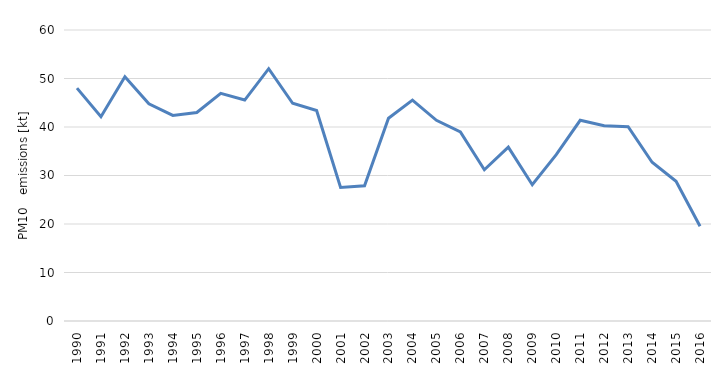
| Category | Series 0 |
|---|---|
| 1990.0 | 48.019 |
| 1991.0 | 42.111 |
| 1992.0 | 50.355 |
| 1993.0 | 44.773 |
| 1994.0 | 42.382 |
| 1995.0 | 42.982 |
| 1996.0 | 46.926 |
| 1997.0 | 45.554 |
| 1998.0 | 52.024 |
| 1999.0 | 44.889 |
| 2000.0 | 43.41 |
| 2001.0 | 27.53 |
| 2002.0 | 27.88 |
| 2003.0 | 41.805 |
| 2004.0 | 45.55 |
| 2005.0 | 41.379 |
| 2006.0 | 38.985 |
| 2007.0 | 31.183 |
| 2008.0 | 35.859 |
| 2009.0 | 28.093 |
| 2010.0 | 34.295 |
| 2011.0 | 41.387 |
| 2012.0 | 40.257 |
| 2013.0 | 40.067 |
| 2014.0 | 32.734 |
| 2015.0 | 28.822 |
| 2016.0 | 19.549 |